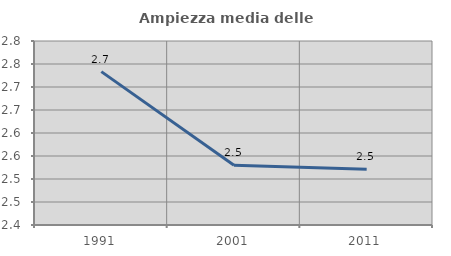
| Category | Ampiezza media delle famiglie |
|---|---|
| 1991.0 | 2.733 |
| 2001.0 | 2.53 |
| 2011.0 | 2.521 |